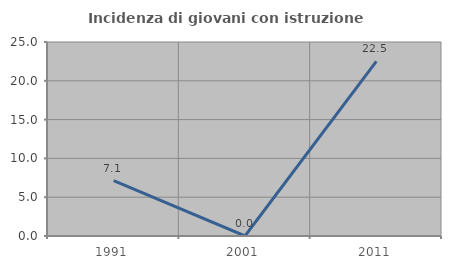
| Category | Incidenza di giovani con istruzione universitaria |
|---|---|
| 1991.0 | 7.143 |
| 2001.0 | 0 |
| 2011.0 | 22.5 |